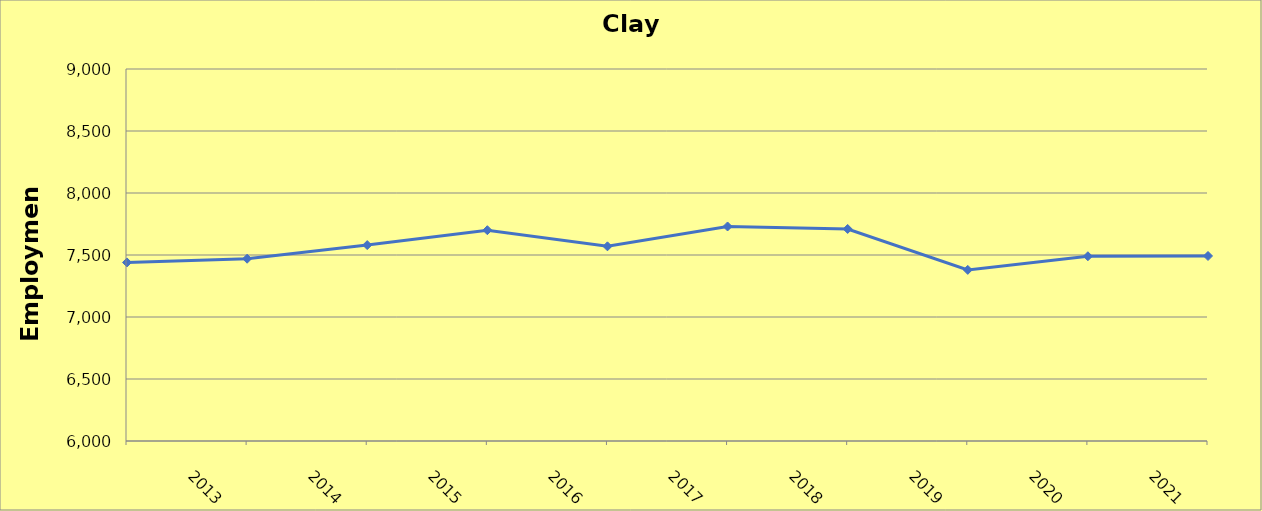
| Category | Clay County |
|---|---|
| 2013.0 | 7440 |
| 2014.0 | 7470 |
| 2015.0 | 7580 |
| 2016.0 | 7700 |
| 2017.0 | 7570 |
| 2018.0 | 7730 |
| 2019.0 | 7710 |
| 2020.0 | 7380 |
| 2021.0 | 7490 |
| 2022.0 | 7492 |